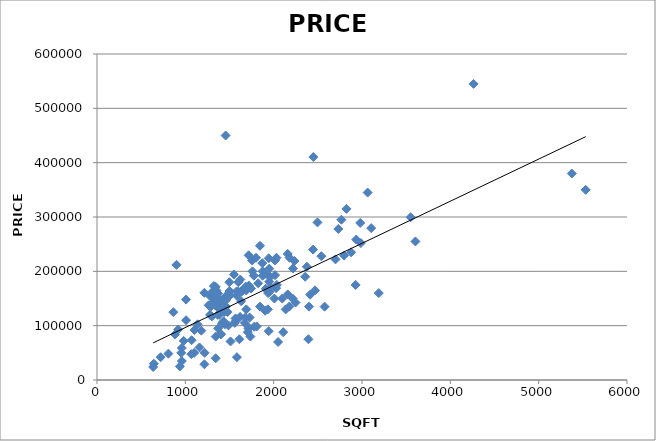
| Category | PRICE |
|---|---|
| 636.0 | 24000 |
| 938.0 | 25000 |
| 1216.0 | 28900 |
| 644.0 | 30000 |
| 960.0 | 34900 |
| 1344.0 | 40000 |
| 1584.0 | 42000 |
| 720.0 | 42000 |
| 1068.0 | 47500 |
| 808.0 | 48500 |
| 1100.0 | 49950 |
| 954.0 | 50000 |
| 1218.0 | 50000 |
| 960.0 | 58900 |
| 1160.0 | 59900 |
| 2050.0 | 70000 |
| 1512.0 | 71000 |
| 981.0 | 72000 |
| 1071.0 | 73300 |
| 2394.0 | 75000 |
| 1612.0 | 75000 |
| 1344.0 | 79900 |
| 1736.0 | 80000 |
| 884.0 | 83945 |
| 1404.0 | 84000 |
| 1400.0 | 85000 |
| 1707.0 | 88000 |
| 2108.0 | 88000 |
| 1944.0 | 90000 |
| 1181.0 | 90816 |
| 1104.0 | 91900 |
| 919.0 | 93000 |
| 1716.0 | 94500 |
| 1372.0 | 95000 |
| 1720.0 | 96000 |
| 1780.0 | 98000 |
| 1808.0 | 98500 |
| 1488.0 | 100400 |
| 1138.0 | 102500 |
| 1448.0 | 102500 |
| 1416.0 | 104500 |
| 1674.0 | 105000 |
| 1560.0 | 105000 |
| 1568.0 | 108000 |
| 1433.0 | 108000 |
| 1008.0 | 110000 |
| 1568.0 | 113300 |
| 1728.0 | 115000 |
| 1680.0 | 115000 |
| 1620.0 | 116200 |
| 1300.0 | 117000 |
| 1280.0 | 119900 |
| 1384.0 | 120000 |
| 1366.0 | 120000 |
| 864.0 | 124900 |
| 1478.0 | 125000 |
| 1440.0 | 125000 |
| 1904.0 | 127500 |
| 1934.0 | 130000 |
| 2136.0 | 130000 |
| 1388.0 | 130000 |
| 1408.0 | 130000 |
| 1690.0 | 130000 |
| 1416.0 | 133864 |
| 1287.0 | 134900 |
| 1460.0 | 135000 |
| 2577.0 | 135000 |
| 1846.0 | 135000 |
| 2400.0 | 135000 |
| 2176.0 | 135000 |
| 1344.0 | 137000 |
| 1264.0 | 137500 |
| 1287.0 | 138000 |
| 1400.0 | 139900 |
| 1388.0 | 139900 |
| 1312.0 | 140000 |
| 1313.0 | 142500 |
| 2247.0 | 142500 |
| 1400.0 | 144900 |
| 1400.0 | 144900 |
| 1400.0 | 144900 |
| 1344.0 | 145000 |
| 1632.0 | 145000 |
| 1456.0 | 146200 |
| 1400.0 | 146500 |
| 1344.0 | 147000 |
| 1325.0 | 147950 |
| 1008.0 | 148000 |
| 1432.0 | 148800 |
| 2097.0 | 149900 |
| 2008.0 | 150000 |
| 1382.0 | 150000 |
| 2215.0 | 150000 |
| 1456.0 | 153500 |
| 1277.0 | 155000 |
| 1502.0 | 155000 |
| 1584.0 | 155000 |
| 1500.0 | 156900 |
| 2412.0 | 157000 |
| 2159.0 | 157500 |
| 1371.0 | 159000 |
| 1344.0 | 160000 |
| 3190.0 | 160000 |
| 1937.0 | 160000 |
| 1216.0 | 160450 |
| 1300.0 | 161300 |
| 1497.0 | 161650 |
| 1954.0 | 162500 |
| 1600.0 | 162900 |
| 1580.0 | 163000 |
| 1640.0 | 163000 |
| 1500.0 | 163900 |
| 1690.0 | 164900 |
| 1350.0 | 165000 |
| 1931.0 | 165000 |
| 2468.0 | 165000 |
| 1911.0 | 168000 |
| 1662.0 | 168000 |
| 1744.0 | 168500 |
| 2028.0 | 169000 |
| 1972.0 | 169900 |
| 1344.0 | 171500 |
| 1684.0 | 172000 |
| 1323.0 | 172900 |
| 1720.0 | 173600 |
| 2036.0 | 174950 |
| 2928.0 | 175000 |
| 1824.0 | 178000 |
| 1600.0 | 180000 |
| 1499.0 | 180000 |
| 1950.0 | 181000 |
| 1622.0 | 184900 |
| 1962.0 | 190000 |
| 2357.0 | 190000 |
| 1875.0 | 192000 |
| 1776.0 | 192000 |
| 2016.0 | 193000 |
| 1550.0 | 194172 |
| 1915.0 | 194900 |
| 1900.0 | 198000 |
| 1875.0 | 200000 |
| 1760.0 | 200000 |
| 1950.0 | 205000 |
| 2218.0 | 205250 |
| 2376.0 | 208400 |
| 900.0 | 212000 |
| 1872.0 | 215000 |
| 2235.0 | 219000 |
| 1757.0 | 220000 |
| 2016.0 | 220000 |
| 2700.0 | 222000 |
| 1944.0 | 224000 |
| 1800.0 | 225000 |
| 2180.0 | 225000 |
| 2032.0 | 225000 |
| 2540.0 | 227900 |
| 2798.0 | 229000 |
| 1717.0 | 229500 |
| 2159.0 | 232000 |
| 2877.0 | 235000 |
| 2446.0 | 240000 |
| 1845.0 | 247000 |
| 2987.0 | 252000 |
| 3605.0 | 255000 |
| 2935.0 | 258500 |
| 2732.0 | 278000 |
| 3104.0 | 279500 |
| 2980.0 | 289000 |
| 2496.0 | 290000 |
| 2767.0 | 295000 |
| 3551.0 | 299500 |
| 2824.0 | 315000 |
| 3064.0 | 345000 |
| 5532.0 | 350000 |
| 5375.0 | 380000 |
| 2449.0 | 410400 |
| 1456.0 | 450000 |
| 4263.0 | 545000 |